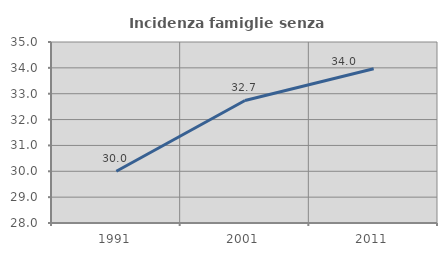
| Category | Incidenza famiglie senza nuclei |
|---|---|
| 1991.0 | 30 |
| 2001.0 | 32.74 |
| 2011.0 | 33.963 |